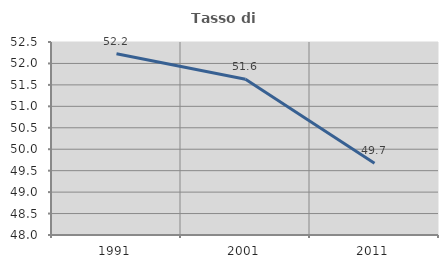
| Category | Tasso di occupazione   |
|---|---|
| 1991.0 | 52.226 |
| 2001.0 | 51.631 |
| 2011.0 | 49.675 |